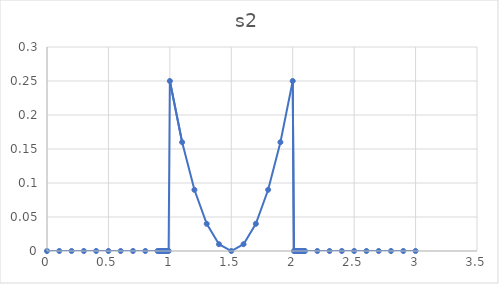
| Category | Series 0 |
|---|---|
| 0.0 | 0 |
| 0.1 | 0 |
| 0.2 | 0 |
| 0.3 | 0 |
| 0.4 | 0 |
| 0.5 | 0 |
| 0.6 | 0 |
| 0.7 | 0 |
| 0.8 | 0 |
| 0.9 | 0 |
| 0.91 | 0 |
| 0.92 | 0 |
| 0.93 | 0 |
| 0.94 | 0 |
| 0.95 | 0 |
| 0.96 | 0 |
| 0.97 | 0 |
| 0.98 | 0 |
| 0.99 | 0 |
| 1.0 | 0.25 |
| 1.1 | 0.16 |
| 1.2 | 0.09 |
| 1.3 | 0.04 |
| 1.4 | 0.01 |
| 1.5 | 0 |
| 1.6 | 0.01 |
| 1.7 | 0.04 |
| 1.8 | 0.09 |
| 1.9 | 0.16 |
| 2.0 | 0.25 |
| 2.01 | 0 |
| 2.02 | 0 |
| 2.03 | 0 |
| 2.04 | 0 |
| 2.05 | 0 |
| 2.06 | 0 |
| 2.07 | 0 |
| 2.08 | 0 |
| 2.09 | 0 |
| 2.1 | 0 |
| 2.2 | 0 |
| 2.3 | 0 |
| 2.4 | 0 |
| 2.5 | 0 |
| 2.6 | 0 |
| 2.7 | 0 |
| 2.8 | 0 |
| 2.9 | 0 |
| 3.0 | 0 |